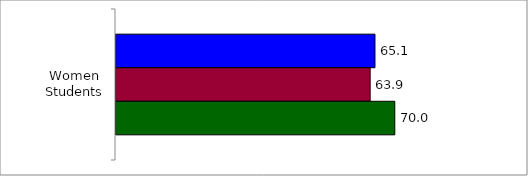
| Category | 50 States and D.C. | SREB States | State |
|---|---|---|---|
| Women Students | 65.069 | 63.855 | 70.047 |